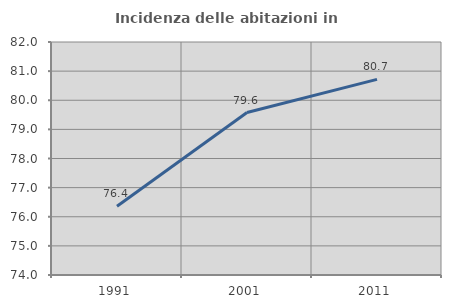
| Category | Incidenza delle abitazioni in proprietà  |
|---|---|
| 1991.0 | 76.363 |
| 2001.0 | 79.578 |
| 2011.0 | 80.717 |